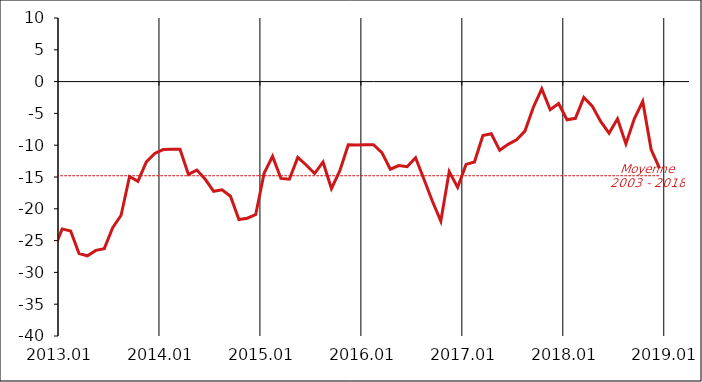
| Category | Series 1 | Moyenne
2003 - 2018 |
|---|---|---|
| 2003-01-20 | -11 | -14.802 |
| 2003-02-20 | -20 | -14.802 |
| 2003-03-20 | -22 | -14.802 |
| 2003-04-20 | -14 | -14.802 |
| 2003-05-20 | -12 | -14.802 |
| 2003-06-20 | -14 | -14.802 |
| 2003-07-20 | -13 | -14.802 |
| 2003-08-20 | -12 | -14.802 |
| 2003-09-20 | -11 | -14.802 |
| 2003-10-20 | -14 | -14.802 |
| 2003-11-20 | -7 | -14.802 |
| 2003-12-20 | -11 | -14.802 |
| 2004-01-20 | -11 | -14.802 |
| 2004-02-20 | -9 | -14.802 |
| 2004-03-20 | -9 | -14.802 |
| 2004-04-20 | -12 | -14.802 |
| 2004-05-20 | -11 | -14.802 |
| 2004-06-20 | -8 | -14.802 |
| 2004-07-20 | -11 | -14.802 |
| 2004-08-20 | -8 | -14.802 |
| 2004-09-20 | -12 | -14.802 |
| 2004-10-20 | -13 | -14.802 |
| 2004-11-20 | -14 | -14.802 |
| 2004-12-20 | -10 | -14.802 |
| 2005-01-20 | -14 | -14.802 |
| 2005-02-20 | -9 | -14.802 |
| 2005-03-20 | -12 | -14.802 |
| 2005-04-20 | -15 | -14.802 |
| 2005-05-20 | -17 | -14.802 |
| 2005-06-20 | -17 | -14.802 |
| 2005-07-20 | -18 | -14.802 |
| 2005-08-20 | -18 | -14.802 |
| 2005-09-20 | -21 | -14.802 |
| 2005-10-20 | -16 | -14.802 |
| 2005-11-20 | -15 | -14.802 |
| 2005-12-20 | -11 | -14.802 |
| 2006-01-20 | -11 | -14.802 |
| 2006-02-20 | -14 | -14.802 |
| 2006-03-20 | -14 | -14.802 |
| 2006-04-20 | -14 | -14.802 |
| 2006-05-20 | -15 | -14.802 |
| 2006-06-20 | -10 | -14.802 |
| 2006-07-20 | -9 | -14.802 |
| 2006-08-20 | -11 | -14.802 |
| 2006-09-20 | -13 | -14.802 |
| 2006-10-20 | -9 | -14.802 |
| 2006-11-20 | -7 | -14.802 |
| 2006-12-20 | -17 | -14.802 |
| 2007-01-20 | -13 | -14.802 |
| 2007-02-20 | -8 | -14.802 |
| 2007-03-20 | -9 | -14.802 |
| 2007-04-20 | -6 | -14.802 |
| 2007-05-20 | -4 | -14.802 |
| 2007-06-20 | -7 | -14.802 |
| 2007-07-20 | -8 | -14.802 |
| 2007-08-20 | -11 | -14.802 |
| 2007-09-20 | -7 | -14.802 |
| 2007-10-20 | -8 | -14.802 |
| 2007-11-20 | -16 | -14.802 |
| 2007-12-20 | -12 | -14.802 |
| 2008-01-20 | -15 | -14.802 |
| 2008-02-20 | -15 | -14.802 |
| 2008-03-20 | -11 | -14.802 |
| 2008-04-20 | -16 | -14.802 |
| 2008-05-20 | -17 | -14.802 |
| 2008-06-20 | -21 | -14.802 |
| 2008-07-20 | -19 | -14.802 |
| 2008-08-20 | -17 | -14.802 |
| 2008-09-20 | -17 | -14.802 |
| 2008-10-20 | -22 | -14.802 |
| 2008-11-20 | -25 | -14.802 |
| 2008-12-20 | -28 | -14.802 |
| 2009-01-20 | -27 | -14.802 |
| 2009-02-20 | -32 | -14.802 |
| 2009-03-20 | -30 | -14.802 |
| 2009-04-20 | -32 | -14.802 |
| 2009-05-20 | -28 | -14.802 |
| 2009-06-20 | -26 | -14.802 |
| 2009-07-20 | -26 | -14.802 |
| 2009-08-20 | -25 | -14.802 |
| 2009-09-20 | -24 | -14.802 |
| 2009-10-20 | -22 | -14.802 |
| 2009-11-20 | -21 | -14.802 |
| 2009-12-20 | -22 | -14.802 |
| 2010-01-20 | -24 | -14.802 |
| 2010-02-20 | -23 | -14.802 |
| 2010-03-20 | -21 | -14.802 |
| 2010-04-20 | -17 | -14.802 |
| 2010-05-20 | -21 | -14.802 |
| 2010-06-20 | -16 | -14.802 |
| 2010-07-20 | -14 | -14.802 |
| 2010-08-20 | -15 | -14.802 |
| 2010-09-20 | -15 | -14.802 |
| 2010-10-20 | -15 | -14.802 |
| 2010-11-20 | -11 | -14.802 |
| 2010-12-20 | -13 | -14.802 |
| 2011-01-20 | -16 | -14.802 |
| 2011-02-20 | -13 | -14.802 |
| 2011-03-20 | -14 | -14.802 |
| 2011-04-20 | -14 | -14.802 |
| 2011-05-20 | -9 | -14.802 |
| 2011-06-20 | -15 | -14.802 |
| 2011-07-20 | -15 | -14.802 |
| 2011-08-20 | -15 | -14.802 |
| 2011-09-20 | -15 | -14.802 |
| 2011-10-20 | -13 | -14.802 |
| 2011-11-20 | -22 | -14.802 |
| 2011-12-20 | -16 | -14.802 |
| 2012-01-20 | -22 | -14.802 |
| 2012-02-20 | -23 | -14.802 |
| 2012-03-20 | -18 | -14.802 |
| 2012-04-20 | -19 | -14.802 |
| 2012-05-20 | -17 | -14.802 |
| 2012-06-20 | -18 | -14.802 |
| 2012-07-20 | -15 | -14.802 |
| 2012-08-20 | -20 | -14.802 |
| 2012-09-20 | -19 | -14.802 |
| 2012-10-20 | -22 | -14.802 |
| 2012-11-20 | -28.868 | -14.802 |
| 2012-12-20 | -26.412 | -14.802 |
| 2013-01-20 | -23.159 | -14.802 |
| 2013-02-20 | -23.478 | -14.802 |
| 2013-03-20 | -27.014 | -14.802 |
| 2013-04-20 | -27.398 | -14.802 |
| 2013-05-20 | -26.536 | -14.802 |
| 2013-06-20 | -26.265 | -14.802 |
| 2013-07-20 | -22.967 | -14.802 |
| 2013-08-20 | -21.009 | -14.802 |
| 2013-09-20 | -14.923 | -14.802 |
| 2013-10-20 | -15.692 | -14.802 |
| 2013-11-20 | -12.612 | -14.802 |
| 2013-12-20 | -11.303 | -14.802 |
| 2014-01-20 | -10.69 | -14.802 |
| 2014-02-20 | -10.641 | -14.802 |
| 2014-03-20 | -10.626 | -14.802 |
| 2014-04-20 | -14.595 | -14.802 |
| 2014-05-20 | -13.912 | -14.802 |
| 2014-06-20 | -15.363 | -14.802 |
| 2014-07-20 | -17.254 | -14.802 |
| 2014-08-20 | -17.002 | -14.802 |
| 2014-09-20 | -18.028 | -14.802 |
| 2014-10-20 | -21.685 | -14.802 |
| 2014-11-20 | -21.478 | -14.802 |
| 2014-12-20 | -20.904 | -14.802 |
| 2015-01-20 | -14.397 | -14.802 |
| 2015-02-20 | -11.752 | -14.802 |
| 2015-03-20 | -15.224 | -14.802 |
| 2015-04-20 | -15.347 | -14.802 |
| 2015-05-20 | -11.911 | -14.802 |
| 2015-06-20 | -13.109 | -14.802 |
| 2015-07-20 | -14.453 | -14.802 |
| 2015-08-20 | -12.63 | -14.802 |
| 2015-09-20 | -16.815 | -14.802 |
| 2015-10-20 | -14.017 | -14.802 |
| 2015-11-20 | -9.918 | -14.802 |
| 2015-12-20 | -9.958 | -14.802 |
| 2016-01-20 | -9.925 | -14.802 |
| 2016-02-20 | -9.928 | -14.802 |
| 2016-03-20 | -11.165 | -14.802 |
| 2016-04-20 | -13.78 | -14.802 |
| 2016-05-20 | -13.198 | -14.802 |
| 2016-06-20 | -13.377 | -14.802 |
| 2016-07-20 | -11.982 | -14.802 |
| 2016-08-20 | -15.345 | -14.802 |
| 2016-09-20 | -18.81 | -14.802 |
| 2016-10-20 | -21.937 | -14.802 |
| 2016-11-20 | -14.144 | -14.802 |
| 2016-12-20 | -16.634 | -14.802 |
| 2017-01-20 | -13.013 | -14.802 |
| 2017-02-20 | -12.638 | -14.802 |
| 2017-03-20 | -8.474 | -14.802 |
| 2017-04-20 | -8.197 | -14.802 |
| 2017-05-20 | -10.808 | -14.802 |
| 2017-06-20 | -9.864 | -14.802 |
| 2017-07-20 | -9.146 | -14.802 |
| 2017-08-20 | -7.786 | -14.802 |
| 2017-09-20 | -4.026 | -14.802 |
| 2017-10-20 | -1.136 | -14.802 |
| 2017-11-20 | -4.424 | -14.802 |
| 2017-12-20 | -3.442 | -14.802 |
| 2018-01-20 | -6.007 | -14.802 |
| 2018-02-20 | -5.772 | -14.802 |
| 2018-03-20 | -2.491 | -14.802 |
| 2018-04-20 | -3.857 | -14.802 |
| 2018-05-20 | -6.265 | -14.802 |
| 2018-06-20 | -8.118 | -14.802 |
| 2018-07-20 | -5.843 | -14.802 |
| 2018-08-20 | -9.788 | -14.802 |
| 2018-09-20 | -5.853 | -14.802 |
| 2018-10-20 | -3.121 | -14.802 |
| 2018-11-20 | -10.675 | -14.802 |
| 2018-12-20 | -13.654 | -14.802 |